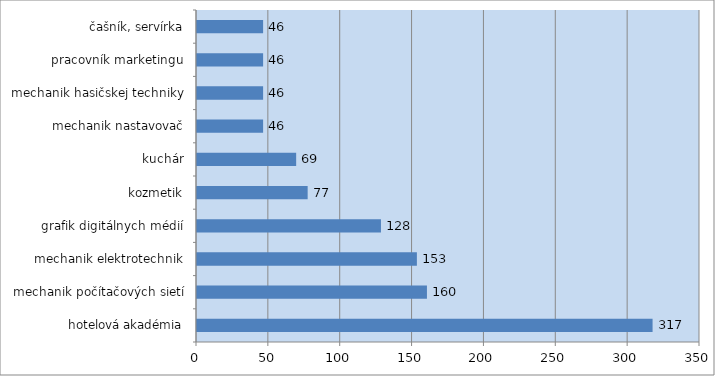
| Category | Series 0 |
|---|---|
| hotelová akadémia | 317 |
| mechanik počítačových sietí | 160 |
| mechanik elektrotechnik | 153 |
| grafik digitálnych médií | 128 |
| kozmetik | 77 |
| kuchár | 69 |
| mechanik nastavovač | 46 |
| mechanik hasičskej techniky | 46 |
| pracovník marketingu | 46 |
| čašník, servírka | 46 |